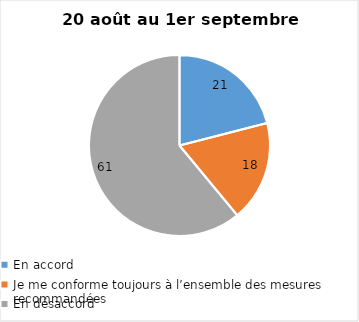
| Category | Series 0 |
|---|---|
| En accord | 21 |
| Je me conforme toujours à l’ensemble des mesures recommandées | 18 |
| En désaccord | 61 |